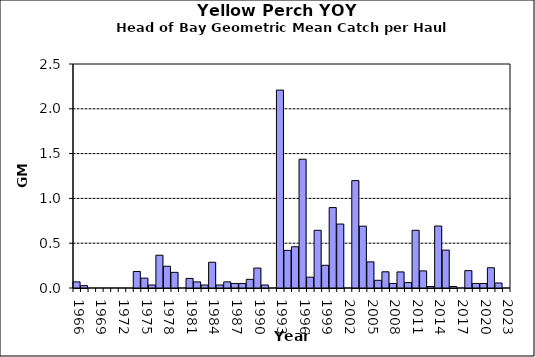
| Category | Series 0 |
|---|---|
| 1966.0 | 0.068 |
| 1967.0 | 0.027 |
| 1968.0 | 0 |
| 1969.0 | 0 |
| 1970.0 | 0 |
| 1971.0 | 0 |
| 1972.0 | 0 |
| 1973.0 | 0 |
| 1974.0 | 0.184 |
| 1975.0 | 0.11 |
| 1976.0 | 0.034 |
| 1977.0 | 0.366 |
| 1978.0 | 0.243 |
| 1979.0 | 0.175 |
| 1980.0 | 0 |
| 1981.0 | 0.107 |
| 1982.0 | 0.068 |
| 1983.0 | 0.034 |
| 1984.0 | 0.287 |
| 1985.0 | 0.034 |
| 1986.0 | 0.068 |
| 1987.0 | 0.051 |
| 1988.0 | 0.051 |
| 1989.0 | 0.097 |
| 1990.0 | 0.222 |
| 1991.0 | 0.034 |
| 1992.0 | 0 |
| 1993.0 | 2.209 |
| 1994.0 | 0.42 |
| 1995.0 | 0.46 |
| 1996.0 | 1.437 |
| 1997.0 | 0.121 |
| 1998.0 | 0.644 |
| 1999.0 | 0.253 |
| 2000.0 | 0.898 |
| 2001.0 | 0.714 |
| 2002.0 | 0 |
| 2003.0 | 1.199 |
| 2004.0 | 0.69 |
| 2005.0 | 0.292 |
| 2006.0 | 0.086 |
| 2007.0 | 0.181 |
| 2008.0 | 0.051 |
| 2009.0 | 0.179 |
| 2010.0 | 0.061 |
| 2011.0 | 0.644 |
| 2012.0 | 0.191 |
| 2013.0 | 0.017 |
| 2014.0 | 0.692 |
| 2015.0 | 0.423 |
| 2016.0 | 0.017 |
| 2017.0 | 0 |
| 2018.0 | 0.194 |
| 2019.0 | 0.051 |
| 2020.0 | 0.05 |
| 2021.0 | 0.226 |
| 2022.0 | 0.056 |
| 2023.0 | 0 |